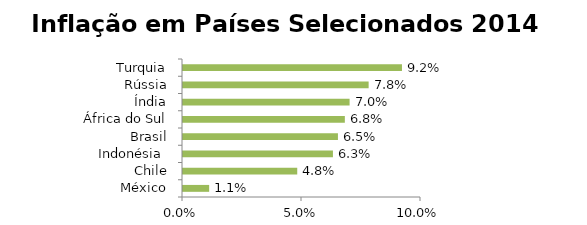
| Category | PIB |
|---|---|
| México | 0.011 |
| Chile | 0.048 |
| Indonésia  | 0.063 |
| Brasil | 0.065 |
| África do Sul | 0.068 |
| Índia | 0.07 |
| Rússia | 0.078 |
| Turquia | 0.092 |